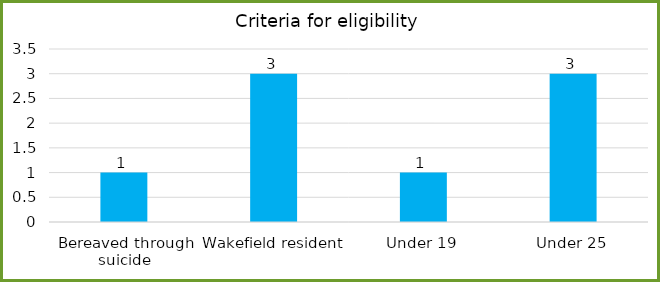
| Category | Series 0 |
|---|---|
| Bereaved through suicide | 1 |
| Wakefield resident | 3 |
| Under 19 | 1 |
| Under 25 | 3 |